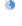
| Category | Series 0 |
|---|---|
| 0 | 44 |
| 1 | 56 |